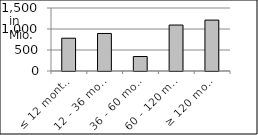
| Category | volume |
|---|---|
| ≤ 12 months | 780539301.75 |
| 12 - 36 months | 893306348.45 |
| 36 - 60 months | 344726370.65 |
| 60 - 120 months | 1094264468.44 |
| ≥ 120 months | 1212039185.691 |